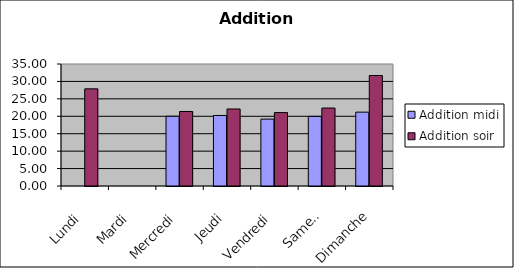
| Category | Addition |
|---|---|
| Lundi | 27.87 |
| Mardi | 0 |
| Mercredi | 21.373 |
| Jeudi | 22.093 |
| Vendredi | 21.06 |
| Samedi | 22.365 |
| Dimanche | 31.695 |